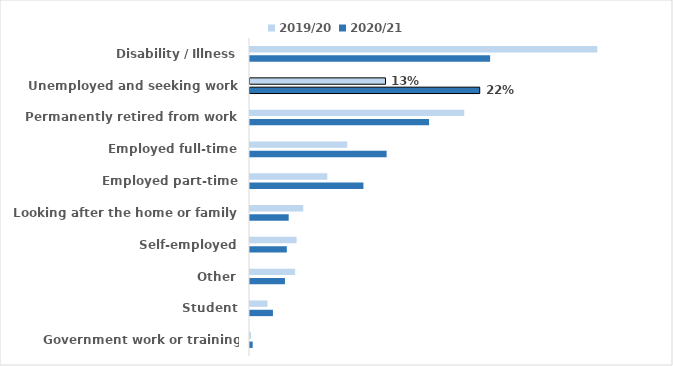
| Category | 2019/20 | 2020/21 |
|---|---|---|
| Disability / Illness | 0.336 | 0.232 |
| Unemployed and seeking work | 0.131 | 0.222 |
| Permanently retired from work | 0.207 | 0.173 |
| Employed full-time | 0.094 | 0.132 |
| Employed part-time | 0.075 | 0.11 |
| Looking after the home or family | 0.051 | 0.037 |
| Self-employed | 0.045 | 0.036 |
| Other | 0.044 | 0.034 |
| Student | 0.017 | 0.022 |
| Government work or training scheme | 0.001 | 0.003 |